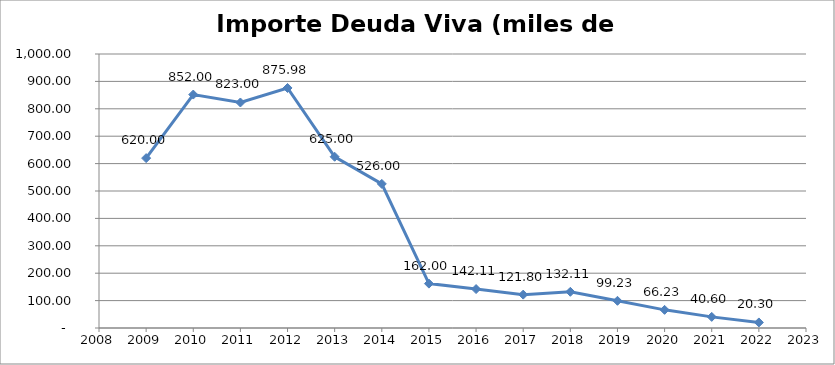
| Category | Importe deuda viva (miles de €) |
|---|---|
| 2009.0 | 620 |
| 2010.0 | 852 |
| 2011.0 | 823 |
| 2012.0 | 875.975 |
| 2013.0 | 625 |
| 2014.0 | 526 |
| 2015.0 | 162 |
| 2016.0 | 142.105 |
| 2017.0 | 121.804 |
| 2018.0 | 132.107 |
| 2019.0 | 99.232 |
| 2020.0 | 66.232 |
| 2021.0 | 40.601 |
| 2022.0 | 20.3 |